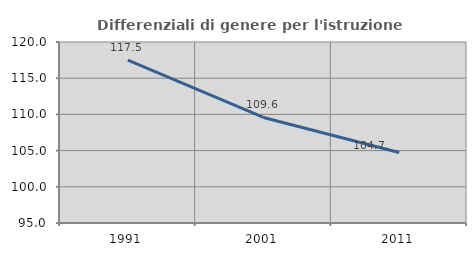
| Category | Differenziali di genere per l'istruzione superiore |
|---|---|
| 1991.0 | 117.487 |
| 2001.0 | 109.577 |
| 2011.0 | 104.733 |